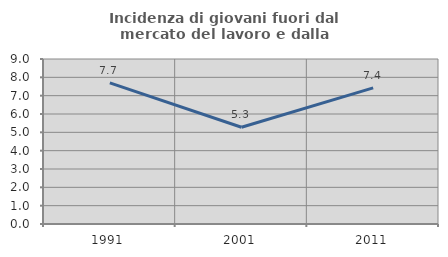
| Category | Incidenza di giovani fuori dal mercato del lavoro e dalla formazione  |
|---|---|
| 1991.0 | 7.7 |
| 2001.0 | 5.275 |
| 2011.0 | 7.427 |